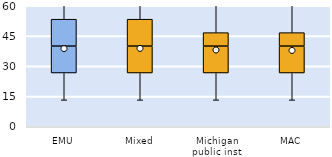
| Category | 25th | 50th | 75th |
|---|---|---|---|
| EMU | 26.667 | 13.333 | 13.333 |
| Mixed | 26.667 | 13.333 | 13.333 |
| Michigan public inst | 26.667 | 13.333 | 6.667 |
| MAC | 26.667 | 13.333 | 6.667 |